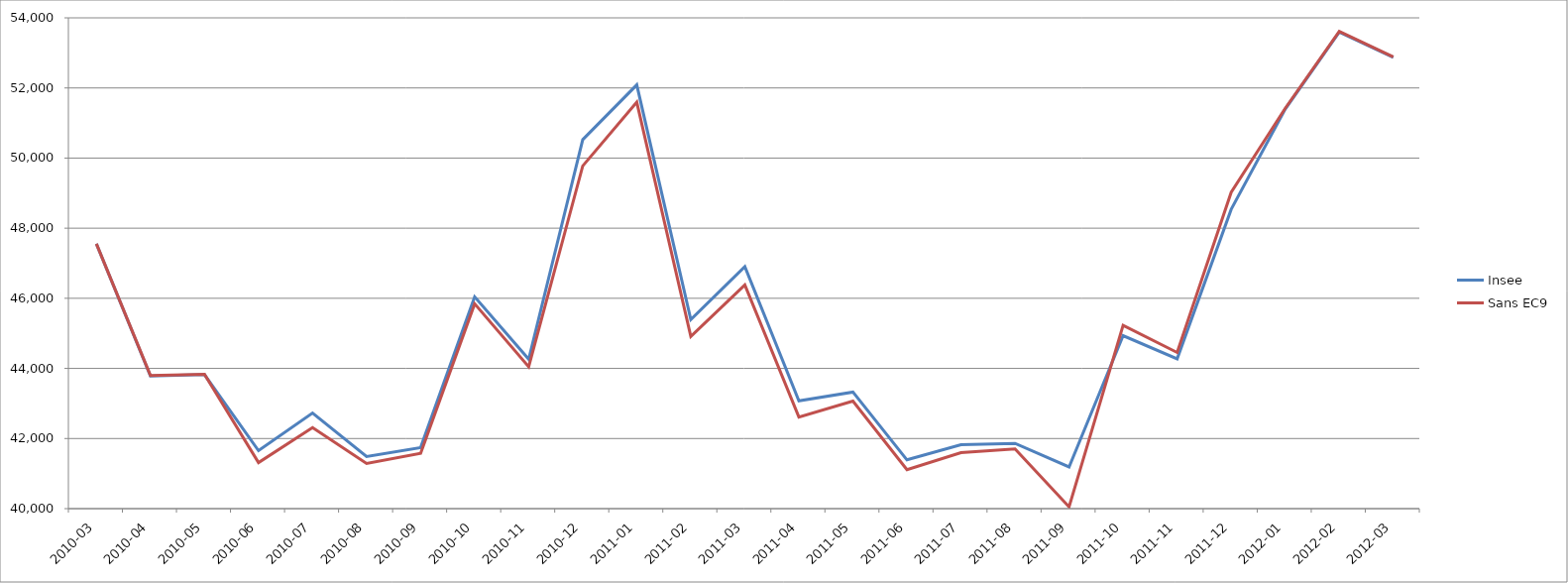
| Category | Insee | Sans EC9 |
|---|---|---|
| 2010-03 | 47555 | 47554 |
| 2010-04 | 43782 | 43800 |
| 2010-05 | 43824 | 43833 |
| 2010-06 | 41654 | 41313 |
| 2010-07 | 42727 | 42309 |
| 2010-08 | 41487 | 41287 |
| 2010-09 | 41743 | 41578 |
| 2010-10 | 46043 | 45844 |
| 2010-11 | 44264 | 44047 |
| 2010-12 | 50525 | 49775 |
| 2011-01 | 52088 | 51594 |
| 2011-02 | 45390 | 44913 |
| 2011-03 | 46906 | 46382 |
| 2011-04 | 43075 | 42612 |
| 2011-05 | 43325 | 43069 |
| 2011-06 | 41391 | 41113 |
| 2011-07 | 41824 | 41597 |
| 2011-08 | 41861 | 41704 |
| 2011-09 | 41188 | 40051 |
| 2011-10 | 44935 | 45227 |
| 2011-11 | 44274 | 44455 |
| 2011-12 | 48538 | 49025 |
| 2012-01 | 51396 | 51419 |
| 2012-02 | 53590 | 53614 |
| 2012-03 | 52871 | 52885 |